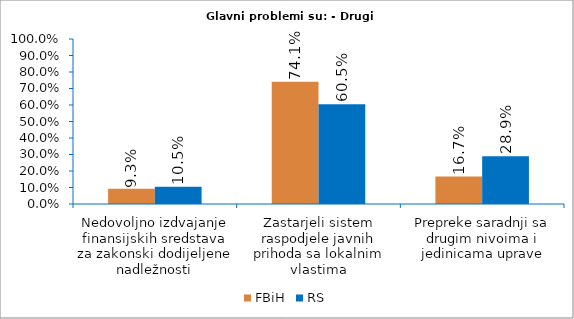
| Category | FBiH | RS |
|---|---|---|
| Nedovoljno izdvajanje finansijskih sredstava za zakonski dodijeljene nadležnosti | 0.093 | 0.105 |
| Zastarjeli sistem raspodjele javnih prihoda sa lokalnim vlastima | 0.741 | 0.605 |
| Prepreke saradnji sa drugim nivoima i jedinicama uprave | 0.167 | 0.289 |